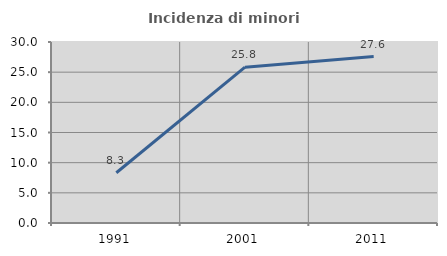
| Category | Incidenza di minori stranieri |
|---|---|
| 1991.0 | 8.333 |
| 2001.0 | 25.833 |
| 2011.0 | 27.586 |